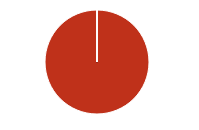
| Category | Total |
|---|---|
| Y | 0 |
| R | 0 |
| T | 0 |
| M | 0 |
| F | 0 |
| N | 202 |